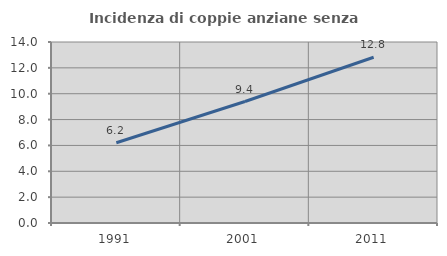
| Category | Incidenza di coppie anziane senza figli  |
|---|---|
| 1991.0 | 6.208 |
| 2001.0 | 9.395 |
| 2011.0 | 12.822 |